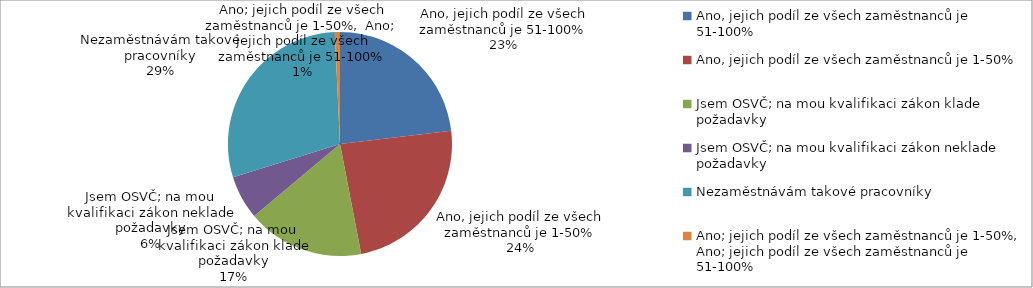
| Category | Series 0 |
|---|---|
| Ano, jejich podíl ze všech zaměstnanců je 51-100% | 187 |
| Ano, jejich podíl ze všech zaměstnanců je 1-50% | 193 |
| Jsem OSVČ; na mou kvalifikaci zákon klade požadavky | 137 |
| Jsem OSVČ; na mou kvalifikaci zákon neklade požadavky | 51 |
| Nezaměstnávám takové pracovníky | 235 |
| Ano; jejich podíl ze všech zaměstnanců je 1-50%,  Ano; jejich podíl ze všech zaměstnanců je 51-100% | 6 |